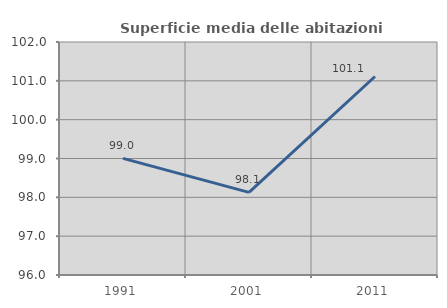
| Category | Superficie media delle abitazioni occupate |
|---|---|
| 1991.0 | 99.004 |
| 2001.0 | 98.128 |
| 2011.0 | 101.111 |